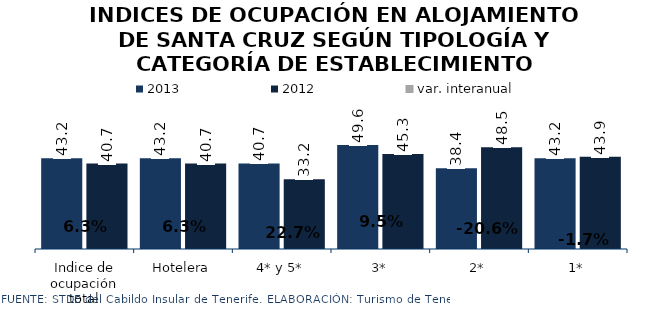
| Category | 2013 | 2012 |
|---|---|---|
| Indice de ocupación total | 43.23 | 40.657 |
| Hotelera | 43.23 | 40.657 |
| 4* y 5* | 40.718 | 33.177 |
| 3* | 49.567 | 45.266 |
| 2* | 38.447 | 48.452 |
| 1* | 43.197 | 43.948 |